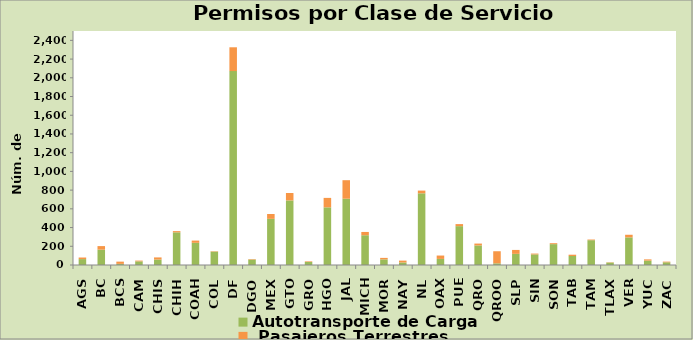
| Category | Autotransporte de Carga  |  Pasajeros Terrestres |
|---|---|---|
| AGS | 63 | 17 |
| BC | 164 | 38 |
| BCS | 12 | 24 |
| CAM | 39 | 8 |
| CHIS | 58 | 23 |
| CHIH | 349 | 13 |
| COAH | 237 | 24 |
| COL | 143 | 4 |
| DF | 2072 | 254 |
| DGO | 58 | 5 |
| MEX | 493 | 52 |
| GTO | 690 | 79 |
| GRO | 33 | 6 |
| HGO | 616 | 101 |
| JAL | 708 | 198 |
| MICH | 318 | 35 |
| MOR | 60 | 16 |
| NAY | 27 | 20 |
| NL | 766 | 29 |
| OAX | 65 | 36 |
| PUE | 415 | 22 |
| QRO | 209 | 20 |
| QROO | 18 | 129 |
| SLP | 119 | 42 |
| SIN | 113 | 9 |
| SON | 223 | 10 |
| TAB | 96 | 14 |
| TAM | 265 | 7 |
| TLAX | 26 | 3 |
| VER | 295 | 28 |
| YUC | 47 | 13 |
| ZAC | 29 | 7 |